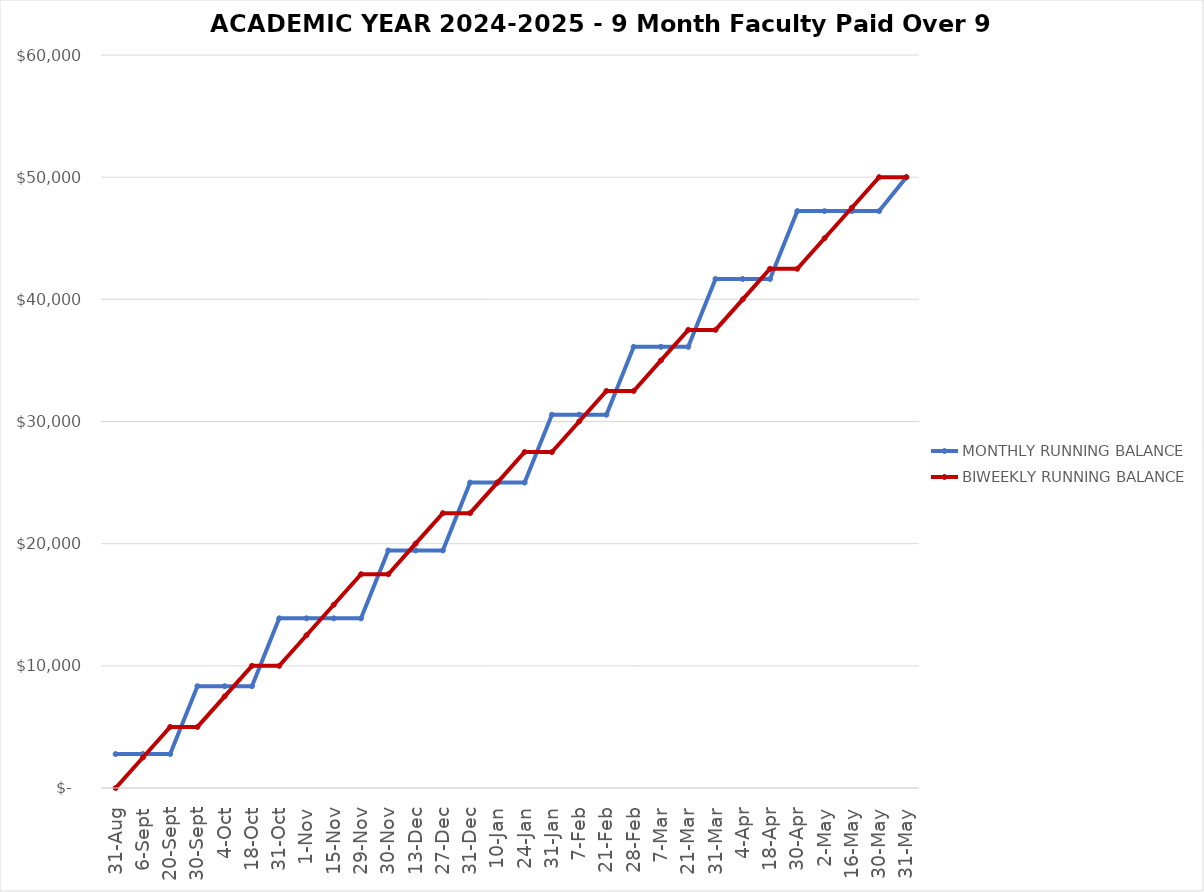
| Category |  MONTHLY RUNNING BALANCE  |  BIWEEKLY RUNNING BALANCE  |
|---|---|---|
| 2023-08-31 | 2777.778 | 0 |
| 2023-09-06 | 2777.778 | 2500 |
| 2023-09-20 | 2777.778 | 5000 |
| 2023-09-30 | 8333.333 | 5000 |
| 2023-10-04 | 8333.333 | 7500 |
| 2023-10-18 | 8333.333 | 10000 |
| 2023-10-31 | 13888.889 | 10000 |
| 2023-11-01 | 13888.889 | 12500 |
| 2023-11-15 | 13888.889 | 15000 |
| 2023-11-29 | 13888.889 | 17500 |
| 2023-11-30 | 19444.444 | 17500 |
| 2023-12-13 | 19444.444 | 20000 |
| 2023-12-27 | 19444.444 | 22500 |
| 2023-12-31 | 25000 | 22500 |
| 2023-01-10 | 25000 | 25000 |
| 2023-01-24 | 25000 | 27500 |
| 2023-01-31 | 30555.556 | 27500 |
| 2023-02-07 | 30555.556 | 30000 |
| 2023-02-21 | 30555.556 | 32500 |
| 2023-02-28 | 36111.111 | 32500 |
| 2023-03-07 | 36111.111 | 35000 |
| 2023-03-21 | 36111.111 | 37500 |
| 2023-03-31 | 41666.667 | 37500 |
| 2023-04-04 | 41666.667 | 40000 |
| 2023-04-18 | 41666.667 | 42500 |
| 2023-04-30 | 47222.222 | 42500 |
| 2023-05-02 | 47222.222 | 45000 |
| 2023-05-16 | 47222.222 | 47500 |
| 2023-05-30 | 47222.222 | 50000 |
| 2023-05-31 | 50000 | 50000 |